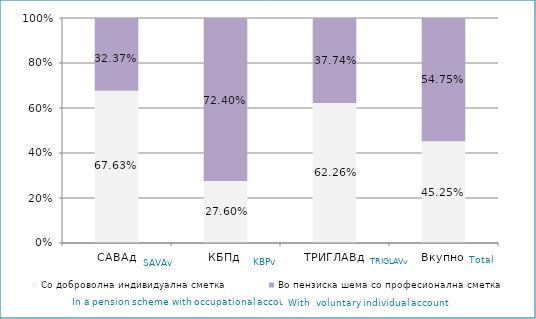
| Category | Со доброволна индивидуална сметка  | Во пензиска шема со професионална сметка |
|---|---|---|
| САВАд | 0.676 | 0.324 |
| КБПд | 0.276 | 0.724 |
| ТРИГЛАВд | 0.623 | 0.377 |
| Вкупно | 0.452 | 0.548 |